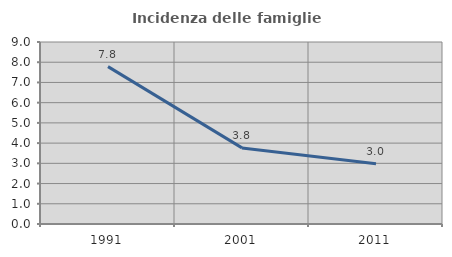
| Category | Incidenza delle famiglie numerose |
|---|---|
| 1991.0 | 7.784 |
| 2001.0 | 3.763 |
| 2011.0 | 2.977 |